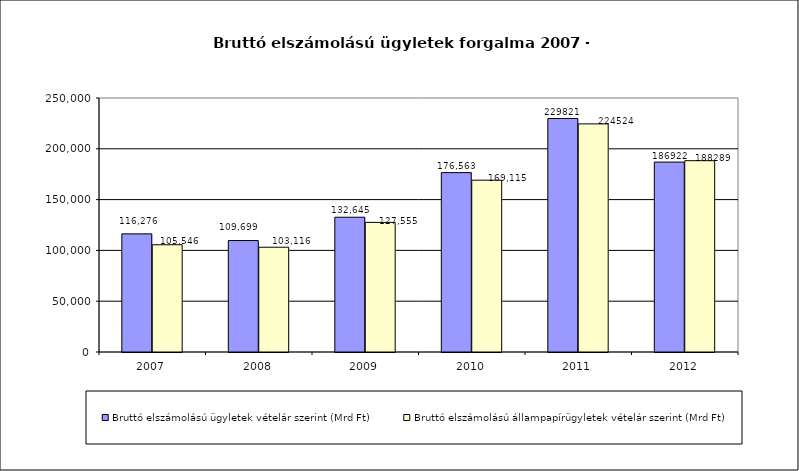
| Category | Bruttó elszámolású ügyletek vételár szerint (Mrd Ft) | Bruttó elszámolású állampapírügyletek vételár szerint (Mrd Ft) |
|---|---|---|
| 2007.0 | 116276 | 105545.79 |
| 2008.0 | 109699 | 103116 |
| 2009.0 | 132645 | 127555 |
| 2010.0 | 176563 | 169115 |
| 2011.0 | 229821 | 224524 |
| 2012.0 | 186922 | 188289 |